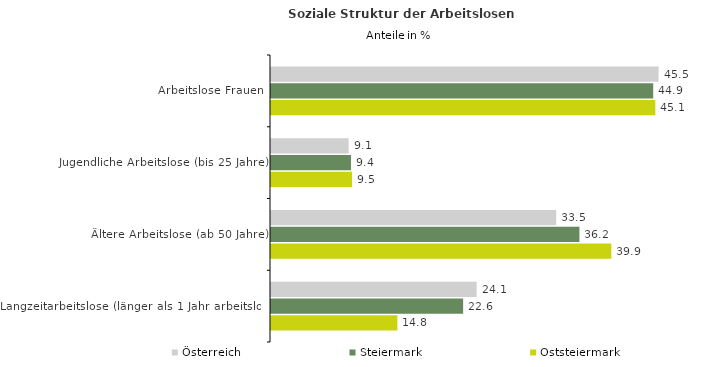
| Category | Österreich | Steiermark | Oststeiermark |
|---|---|---|---|
| Arbeitslose Frauen | 45.49 | 44.861 | 45.109 |
| Jugendliche Arbeitslose (bis 25 Jahre) | 9.111 | 9.387 | 9.507 |
| Ältere Arbeitslose (ab 50 Jahre) | 33.469 | 36.201 | 39.945 |
| Langzeitarbeitslose (länger als 1 Jahr arbeitslos) | 24.136 | 22.55 | 14.836 |